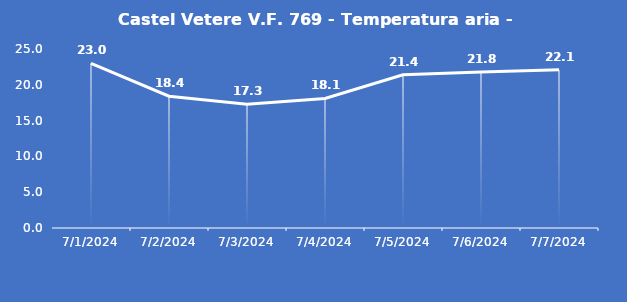
| Category | Castel Vetere V.F. 769 - Temperatura aria - Grezzo (°C) |
|---|---|
| 7/1/24 | 23 |
| 7/2/24 | 18.4 |
| 7/3/24 | 17.3 |
| 7/4/24 | 18.1 |
| 7/5/24 | 21.4 |
| 7/6/24 | 21.8 |
| 7/7/24 | 22.1 |